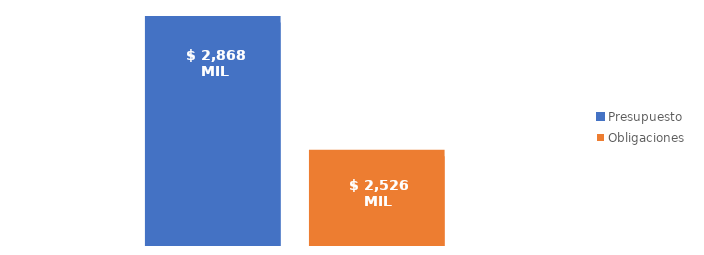
| Category | Presupuesto | Obligaciones |
|---|---|---|
| Total | 2867925716665.956 | 2526446670553.798 |